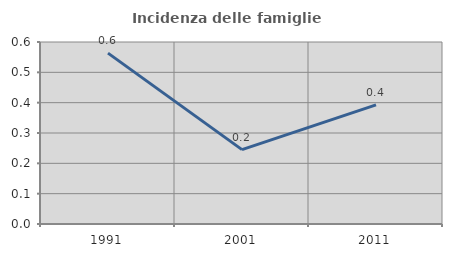
| Category | Incidenza delle famiglie numerose |
|---|---|
| 1991.0 | 0.563 |
| 2001.0 | 0.245 |
| 2011.0 | 0.393 |